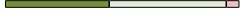
| Category | Series 0 | Series 1 | Series 2 | Series 3 |
|---|---|---|---|---|
| 0 | 8 | 9 | 1 | 0 |